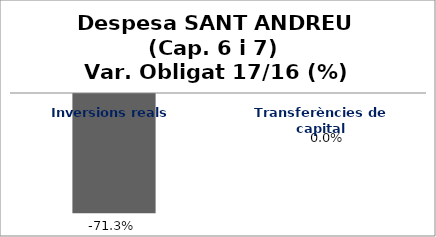
| Category | Series 0 |
|---|---|
| Inversions reals | -0.713 |
| Transferències de capital | 0 |